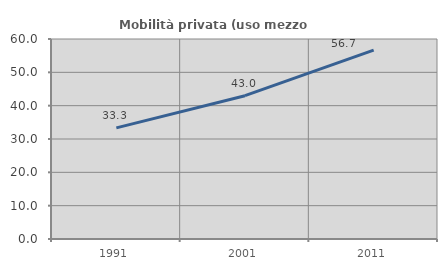
| Category | Mobilità privata (uso mezzo privato) |
|---|---|
| 1991.0 | 33.333 |
| 2001.0 | 42.988 |
| 2011.0 | 56.655 |